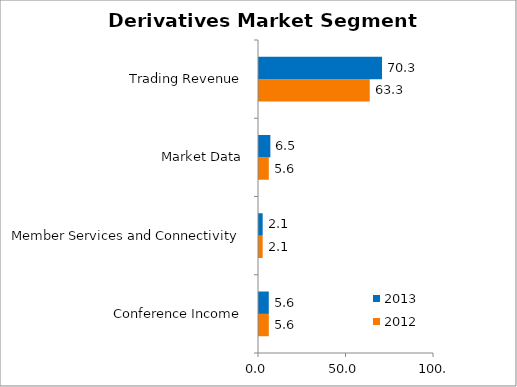
| Category | 2012 | 2013 |
|---|---|---|
| Conference Income | 5.6 | 5.6 |
| Member Services and Connectivity | 2.1 | 2.1 |
| Market Data | 5.6 | 6.5 |
| Trading Revenue | 63.3 | 70.3 |